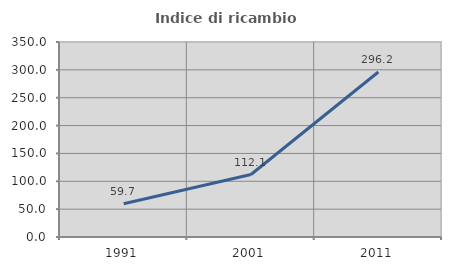
| Category | Indice di ricambio occupazionale  |
|---|---|
| 1991.0 | 59.696 |
| 2001.0 | 112.121 |
| 2011.0 | 296.203 |